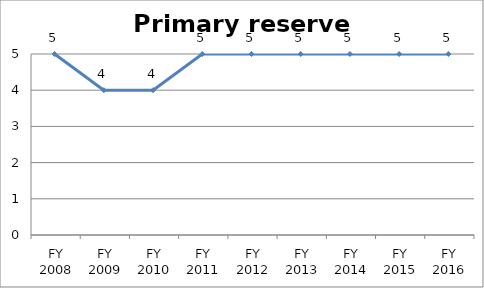
| Category | Primary reserve score |
|---|---|
| FY 2016 | 5 |
| FY 2015 | 5 |
| FY 2014 | 5 |
| FY 2013 | 5 |
| FY 2012 | 5 |
| FY 2011 | 5 |
| FY 2010 | 4 |
| FY 2009 | 4 |
| FY 2008 | 5 |